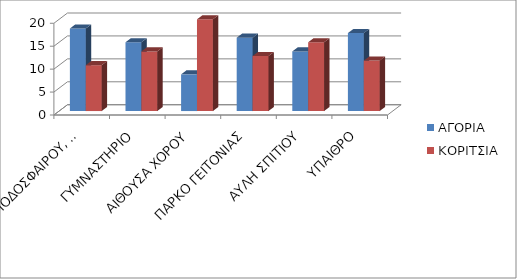
| Category | ΑΓΟΡΙΑ  | ΚΟΡΙΤΣΙΑ |
|---|---|---|
| ΓΗΠΕΔΟ (ΠΟΔΟΣΦΑΙΡΟΥ, ΜΠΑΣΚΕΤ, ΒΟΛΕΪ…) | 18 | 10 |
| ΓΥΜΝΑΣΤΗΡΙΟ | 15 | 13 |
| ΑΙΘΟΥΣΑ ΧΟΡΟΥ | 8 | 20 |
| ΠΑΡΚΟ ΓΕΙΤΟΝΙΑΣ | 16 | 12 |
| ΑΥΛΗ ΣΠΙΤΙΟΥ | 13 | 15 |
| ΥΠΑΙΘΡΟ | 17 | 11 |